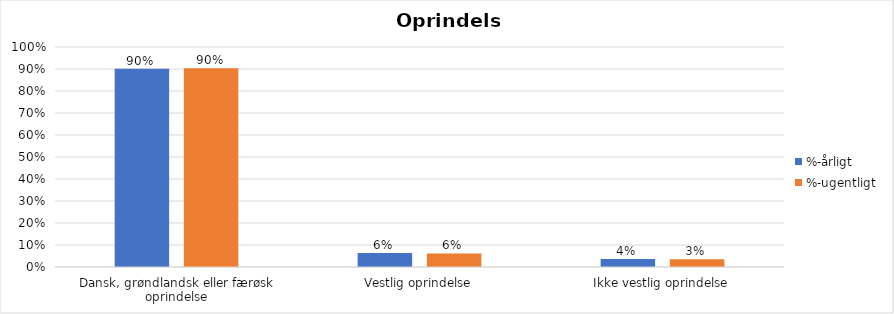
| Category | %-årligt | %-ugentligt |
|---|---|---|
| Dansk, grøndlandsk eller færøsk oprindelse | 0.901 | 0.904 |
| Vestlig oprindelse | 0.063 | 0.062 |
| Ikke vestlig oprindelse | 0.036 | 0.035 |